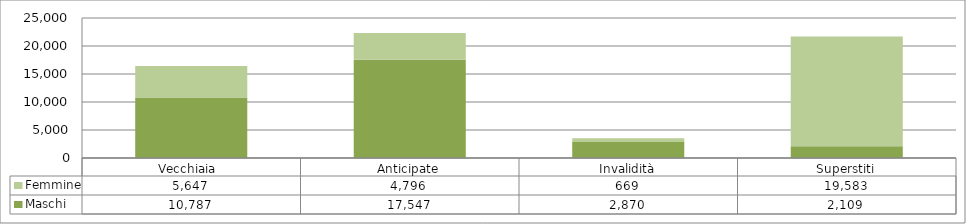
| Category | Maschi | Femmine |
|---|---|---|
| Vecchiaia  | 10787 | 5647 |
| Anticipate | 17547 | 4796 |
| Invalidità | 2870 | 669 |
| Superstiti | 2109 | 19583 |